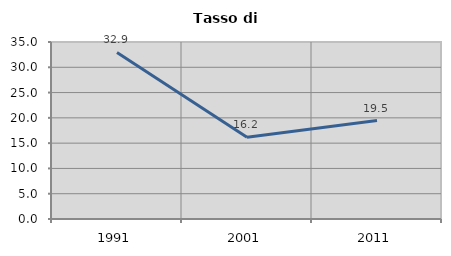
| Category | Tasso di disoccupazione   |
|---|---|
| 1991.0 | 32.934 |
| 2001.0 | 16.184 |
| 2011.0 | 19.469 |